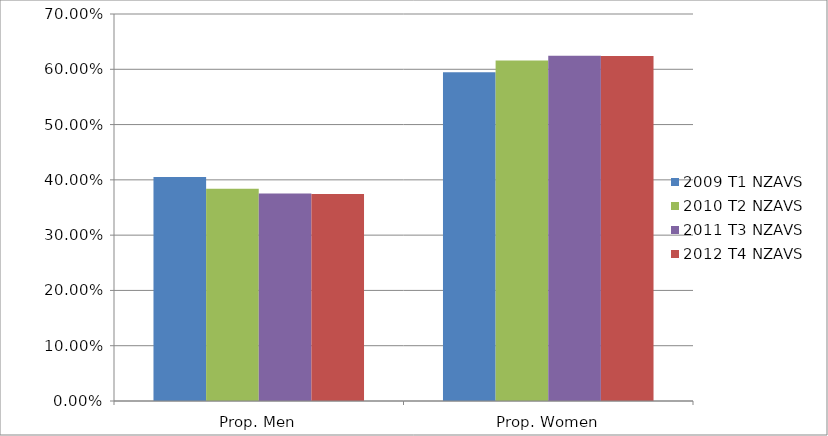
| Category | 2009 T1 NZAVS | 2010 T2 NZAVS | 2011 T3 NZAVS | 2012 T4 NZAVS |
|---|---|---|---|---|
| Prop. Men | 0.405 | 0.384 | 0.375 | 0.375 |
| Prop. Women | 0.595 | 0.616 | 0.624 | 0.624 |